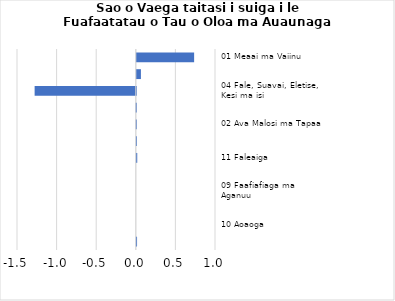
| Category |     Contributions |
|---|---|
| 01 Meaai ma Vaiinu | 0.724 |
| 07 Femalagaiga | 0.052 |
| 04 Fale, Suavai, Eletise, Kesi ma isi | -1.277 |
| 05 Meafale, Mea Faigaluega/Faaleleia o Aiga | -0.006 |
| 02 Ava Malosi ma Tapaa | -0.003 |
| 12 Isi Oloa ma Auaunaga | 0.001 |
| 11 Faleaiga | 0.006 |
| 08 Fesootaiga | 0 |
| 09 Faafiafiaga ma Aganuu | 0 |
| 06 Soifua Maloloina | 0 |
| 10 Aoaoga | 0 |
| 03 Lavalava ma Seevae | 0.003 |